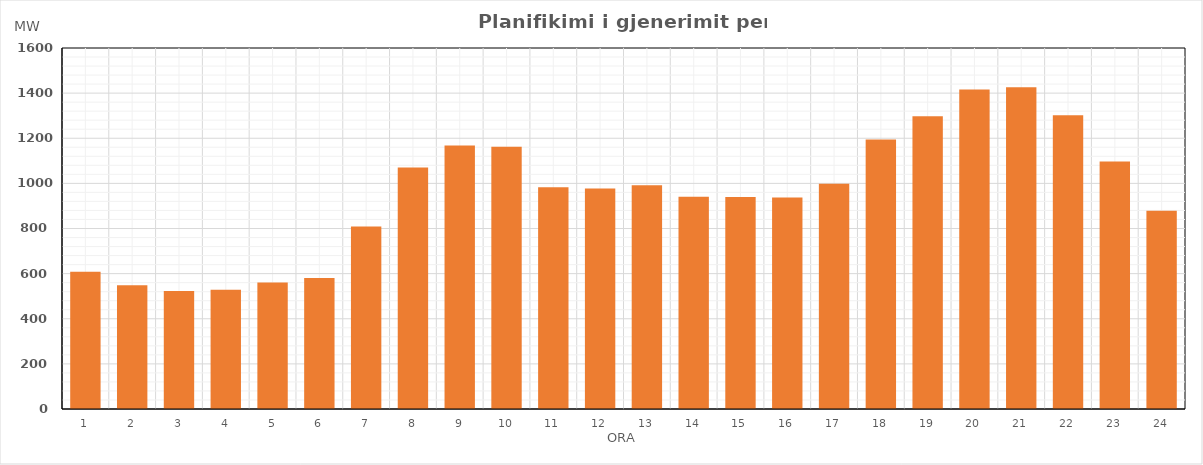
| Category | Max (MW) |
|---|---|
| 0 | 608.48 |
| 1 | 548.41 |
| 2 | 523.4 |
| 3 | 528.4 |
| 4 | 560.39 |
| 5 | 580.39 |
| 6 | 809.38 |
| 7 | 1070.41 |
| 8 | 1167.47 |
| 9 | 1162.47 |
| 10 | 982.41 |
| 11 | 977.5 |
| 12 | 991.43 |
| 13 | 940.4 |
| 14 | 939.43 |
| 15 | 937.44 |
| 16 | 998.43 |
| 17 | 1194.36 |
| 18 | 1297.38 |
| 19 | 1416.49 |
| 20 | 1426.5 |
| 21 | 1302.3 |
| 22 | 1097.3 |
| 23 | 878.34 |